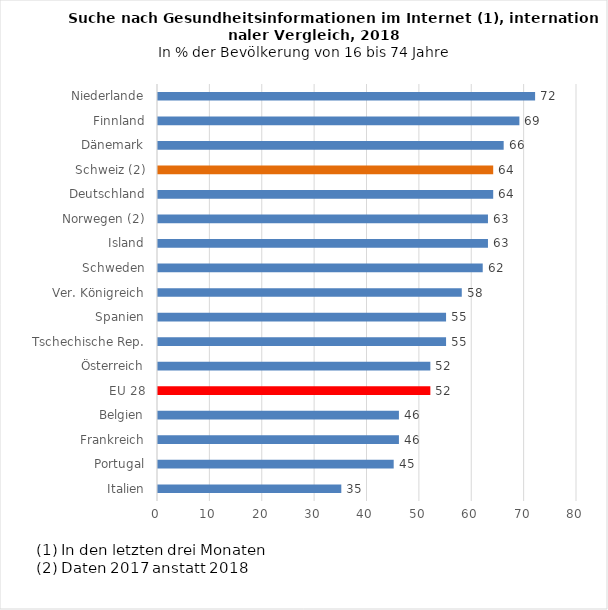
| Category | 2018 |
|---|---|
| Italien | 35 |
| Portugal | 45 |
| Frankreich | 46 |
| Belgien | 46 |
| EU 28 | 52 |
| Österreich | 52 |
| Tschechische Rep. | 55 |
| Spanien | 55 |
| Ver. Königreich | 58 |
| Schweden | 62 |
| Island | 63 |
| Norwegen (2) | 63 |
| Deutschland | 64 |
| Schweiz (2) | 64 |
| Dänemark | 66 |
| Finnland | 69 |
| Niederlande | 72 |